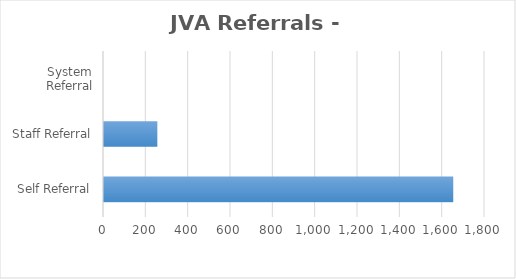
| Category | Series 0 |
|---|---|
| Self Referral | 1650 |
| Staff Referral | 252 |
| System Referral | 0 |